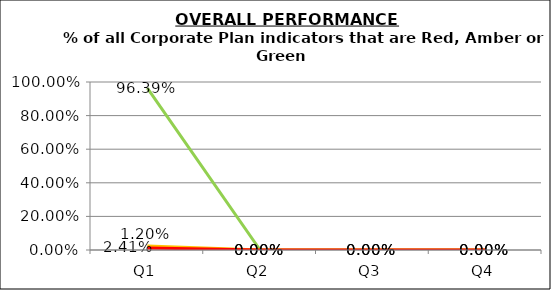
| Category | Green | Amber | Red |
|---|---|---|---|
| Q1 | 0.964 | 0.024 | 0.012 |
| Q2 | 0 | 0 | 0 |
| Q3 | 0 | 0 | 0 |
| Q4 | 0 | 0 | 0 |